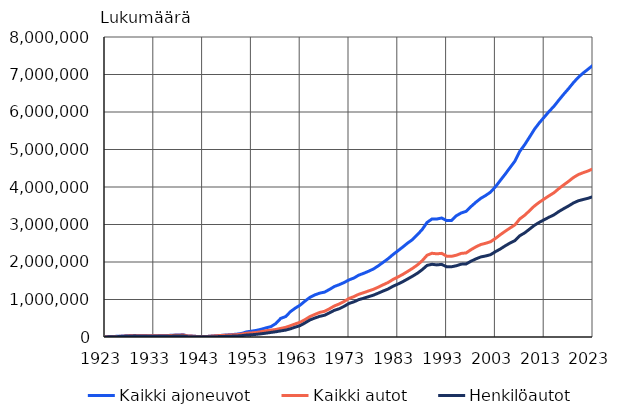
| Category | Kaikki ajoneuvot | Kaikki autot | Henkilöautot |
|---|---|---|---|
| 1923.0 | 5965 | 3576 | 2336 |
| 1924.0 | 10053 | 6678 | 4200 |
| 1925.0 | 15645 | 11921 | 7641 |
| 1926.0 | 21351 | 17230 | 11813 |
| 1927.0 | 28666 | 24376 | 16905 |
| 1928.0 | 37095 | 32190 | 22079 |
| 1929.0 | 40273 | 35030 | 23592 |
| 1930.0 | 40015 | 34781 | 22888 |
| 1931.0 | 38685 | 33959 | 22064 |
| 1932.0 | 35450 | 30843 | 19857 |
| 1933.0 | 34723 | 30167 | 18661 |
| 1934.0 | 36917 | 32101 | 19119 |
| 1935.0 | 38752 | 33811 | 19905 |
| 1936.0 | 41675 | 36558 | 20835 |
| 1937.0 | 48925 | 43299 | 23985 |
| 1938.0 | 53418 | 47226 | 26179 |
| 1939.0 | 59249 | 51771 | 29002 |
| 1940.0 | 28051 | 27161 | 8824 |
| 1941.0 | 23048 | 22808 | 5662 |
| 1942.0 | 12533 | 12438 | 3598 |
| 1943.0 | 14660 | 14560 | 4086 |
| 1944.0 | 15434 | 15363 | 4028 |
| 1945.0 | 26733 | 26310 | 6230 |
| 1946.0 | 35876 | 34489 | 9278 |
| 1947.0 | 44970 | 42270 | 13748 |
| 1948.0 | 54884 | 49135 | 18640 |
| 1949.0 | 64056 | 56193 | 23167 |
| 1950.0 | 75447 | 61256 | 26814 |
| 1951.0 | 94814 | 76206 | 36231 |
| 1952.0 | 136184 | 101252 | 52619 |
| 1953.0 | 155132 | 108270 | 59216 |
| 1954.0 | 176122 | 120687 | 70795 |
| 1955.0 | 205519 | 141576 | 85448 |
| 1956.0 | 244041 | 167078 | 102961 |
| 1957.0 | 276659 | 183813 | 122075 |
| 1958.0 | 357744 | 200088 | 139704 |
| 1959.0 | 495720 | 228918 | 162968 |
| 1960.0 | 543597 | 256892 | 183409 |
| 1961.0 | 675347 | 301586 | 219148 |
| 1962.0 | 771197 | 349888 | 263033 |
| 1963.0 | 851133 | 393920 | 305444 |
| 1964.0 | 958854 | 464255 | 375829 |
| 1965.0 | 1057604 | 544856 | 454854 |
| 1966.0 | 1123515 | 602092 | 505926 |
| 1967.0 | 1169569 | 655757 | 551198 |
| 1968.0 | 1196985 | 685475 | 580747 |
| 1969.0 | 1268791 | 752696 | 643057 |
| 1970.0 | 1346645 | 828010 | 711968 |
| 1971.0 | 1395445 | 880056 | 752915 |
| 1972.0 | 1452715 | 947906 | 818044 |
| 1973.0 | 1522975 | 1028120 | 894104 |
| 1974.0 | 1572635 | 1076208 | 936681 |
| 1975.0 | 1649574 | 1139967 | 996284 |
| 1976.0 | 1697337 | 1181473 | 1032884 |
| 1977.0 | 1753163 | 1227646 | 1075399 |
| 1978.0 | 1813293 | 1270802 | 1115265 |
| 1979.0 | 1897640 | 1329558 | 1169501 |
| 1980.0 | 1991908 | 1392827 | 1225931 |
| 1981.0 | 2086549 | 1452631 | 1279192 |
| 1982.0 | 2197052 | 1532697 | 1352055 |
| 1983.0 | 2296279 | 1597956 | 1410438 |
| 1984.0 | 2397519 | 1667987 | 1473975 |
| 1985.0 | 2502803 | 1746615 | 1546094 |
| 1986.0 | 2596454 | 1828949 | 1619848 |
| 1987.0 | 2725880 | 1919719 | 1698671 |
| 1988.0 | 2866693 | 2034166 | 1795908 |
| 1989.0 | 3055555 | 2180532 | 1908971 |
| 1990.0 | 3146308 | 2233059 | 1938856 |
| 1991.0 | 3146228 | 2218067 | 1922541 |
| 1992.0 | 3173342 | 2230516 | 1936345 |
| 1993.0 | 3104416 | 2156009 | 1872933 |
| 1994.0 | 3108601 | 2150950 | 1872588 |
| 1995.0 | 3233129 | 2181239 | 1900855 |
| 1996.0 | 3308188 | 2229222 | 1942752 |
| 1997.0 | 3351189 | 2242318 | 1948126 |
| 1998.0 | 3478462 | 2328990 | 2021116 |
| 1999.0 | 3593512 | 2403327 | 2082580 |
| 2000.0 | 3697037 | 2465822 | 2134728 |
| 2001.0 | 3773373 | 2499154 | 2160603 |
| 2002.0 | 3863152 | 2539953 | 2194683 |
| 2003.0 | 4004323 | 2626999 | 2274577 |
| 2004.0 | 4174287 | 2727160 | 2346726 |
| 2005.0 | 4341229 | 2818965 | 2430345 |
| 2006.0 | 4517669 | 2906415 | 2505543 |
| 2007.0 | 4689452 | 2989881 | 2570356 |
| 2008.0 | 4950760 | 3150296 | 2700492 |
| 2009.0 | 5128067 | 3246414 | 2776664 |
| 2010.0 | 5331582 | 3368188 | 2877484 |
| 2011.0 | 5539322 | 3494357 | 2978729 |
| 2012.0 | 5711264 | 3592718 | 3057484 |
| 2013.0 | 5862216 | 3681137 | 3127399 |
| 2014.0 | 6014610 | 3766018 | 3194950 |
| 2015.0 | 6152680 | 3847045 | 3257581 |
| 2016.0 | 6316531 | 3957153 | 3346005 |
| 2017.0 | 6474783 | 4056725 | 3422792 |
| 2018.0 | 6623990 | 4151275 | 3494836 |
| 2019.0 | 6785012 | 4253776 | 3574570 |
| 2020.0 | 6926137 | 4331699 | 3632851 |
| 2021.0 | 7040869 | 4382322 | 3667164 |
| 2022.0 | 7142503 | 4428076 | 3699634 |
| 2023.0 | 7247926 | 4485152 | 3744469 |